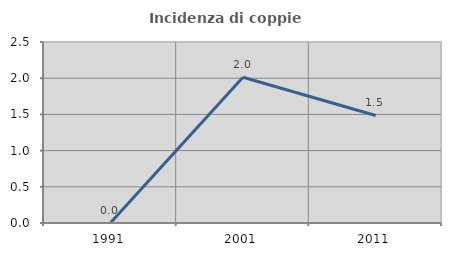
| Category | Incidenza di coppie miste |
|---|---|
| 1991.0 | 0 |
| 2001.0 | 2.012 |
| 2011.0 | 1.485 |